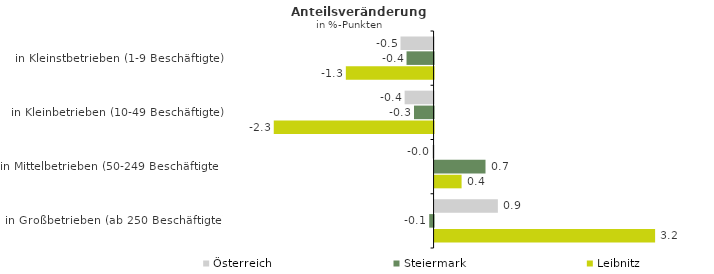
| Category | Österreich | Steiermark | Leibnitz |
|---|---|---|---|
| in Kleinstbetrieben (1-9 Beschäftigte) | -0.48 | -0.393 | -1.274 |
| in Kleinbetrieben (10-49 Beschäftigte) | -0.42 | -0.284 | -2.321 |
| in Mittelbetrieben (50-249 Beschäftigte) | -0.019 | 0.74 | 0.392 |
| in Großbetrieben (ab 250 Beschäftigte) | 0.919 | -0.063 | 3.203 |